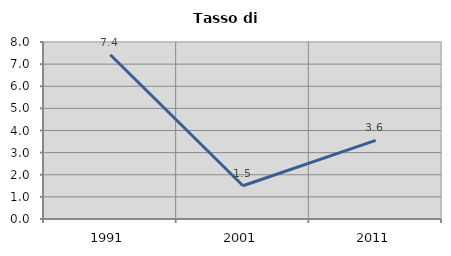
| Category | Tasso di disoccupazione   |
|---|---|
| 1991.0 | 7.424 |
| 2001.0 | 1.504 |
| 2011.0 | 3.552 |